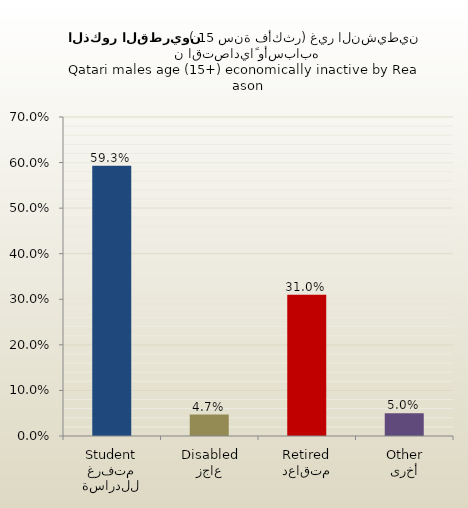
| Category | الذكور القطريين |
|---|---|
| متفرغ للدراسة
Student | 0.593 |
| عاجز
Disabled | 0.047 |
| متقاعد
Retired | 0.31 |
| أخرى
Other | 0.05 |